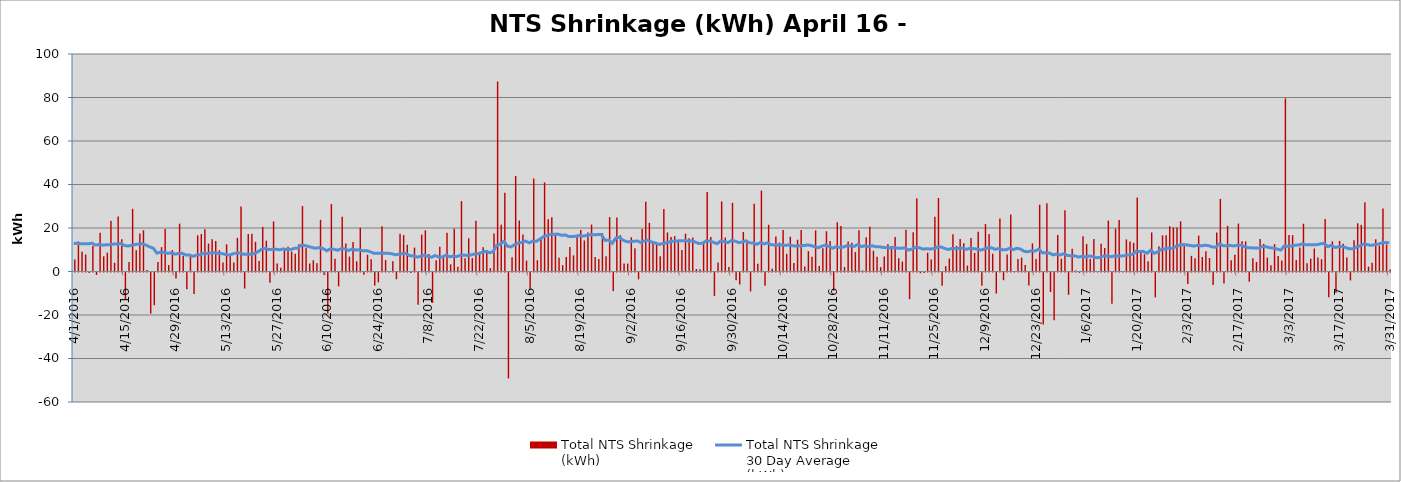
| Category | Total NTS Shrinkage
(kWh) |
|---|---|
| 4/1/16 | 5535887 |
| 4/2/16 | 13806413 |
| 4/3/16 | 9043796 |
| 4/4/16 | 7818288 |
| 4/5/16 | -262975 |
| 4/6/16 | 11727477 |
| 4/7/16 | -1105545 |
| 4/8/16 | 17761218 |
| 4/9/16 | 6972202 |
| 4/10/16 | 8642126 |
| 4/11/16 | 23282328 |
| 4/12/16 | 4011712 |
| 4/13/16 | 25294229 |
| 4/14/16 | 14867007 |
| 4/15/16 | -12330640 |
| 4/16/16 | 4421650 |
| 4/17/16 | 28817961 |
| 4/18/16 | 9772450 |
| 4/19/16 | 17524811 |
| 4/20/16 | 18972605 |
| 4/21/16 | 736150 |
| 4/22/16 | -18893691 |
| 4/23/16 | -15030541 |
| 4/24/16 | 4410582 |
| 4/25/16 | 11186961 |
| 4/26/16 | 19550488 |
| 4/27/16 | 2937112 |
| 4/28/16 | 9830118 |
| 4/29/16 | -2779713 |
| 4/30/16 | 22015972 |
| 5/1/16 | 7262252 |
| 5/2/16 | -7711497 |
| 5/3/16 | 7719483 |
| 5/4/16 | -9850590 |
| 5/5/16 | 16650554 |
| 5/6/16 | 17218141 |
| 5/7/16 | 19382453 |
| 5/8/16 | 12860168 |
| 5/9/16 | 14794720 |
| 5/10/16 | 13971912 |
| 5/11/16 | 9775796 |
| 5/12/16 | 4120797 |
| 5/13/16 | 12513168 |
| 5/14/16 | 7119777 |
| 5/15/16 | 4094843 |
| 5/16/16 | 15469294 |
| 5/17/16 | 29934743 |
| 5/18/16 | -7371971 |
| 5/19/16 | 17247708 |
| 5/20/16 | 17309931 |
| 5/21/16 | 13644269 |
| 5/22/16 | 4817087 |
| 5/23/16 | 20541324 |
| 5/24/16 | 14177822 |
| 5/25/16 | -4707552 |
| 5/26/16 | 23011309 |
| 5/27/16 | 3632244 |
| 5/28/16 | 1768132 |
| 5/29/16 | 10438132 |
| 5/30/16 | 11339676 |
| 5/31/16 | 9140720 |
| 6/1/16 | 8213635 |
| 6/2/16 | 12507140 |
| 6/3/16 | 30059560 |
| 6/4/16 | 10862901 |
| 6/5/16 | 3662227 |
| 6/6/16 | 5151322 |
| 6/7/16 | 3836781 |
| 6/8/16 | 23750954 |
| 6/9/16 | -1099687 |
| 6/10/16 | -18814241 |
| 6/11/16 | 30977345 |
| 6/12/16 | 5807415 |
| 6/13/16 | -6386243 |
| 6/14/16 | 25222743 |
| 6/15/16 | 12856348 |
| 6/16/16 | 6869801 |
| 6/17/16 | 13528859 |
| 6/18/16 | 4698453 |
| 6/19/16 | 20094654 |
| 6/20/16 | -1000782 |
| 6/21/16 | 7684253 |
| 6/22/16 | 5607083 |
| 6/23/16 | -5980700 |
| 6/24/16 | -4521270 |
| 6/25/16 | 20855920 |
| 6/26/16 | 5253551 |
| 6/27/16 | 5006 |
| 6/28/16 | 4663169 |
| 6/29/16 | -3116849 |
| 6/30/16 | 17332159 |
| 7/1/16 | 16724151 |
| 7/2/16 | 12317452 |
| 7/3/16 | -280087 |
| 7/4/16 | 11000825 |
| 7/5/16 | -14883298 |
| 7/6/16 | 16949783 |
| 7/7/16 | 18952385 |
| 7/8/16 | 8029232 |
| 7/9/16 | -13945656 |
| 7/10/16 | 5147579 |
| 7/11/16 | 11349203 |
| 7/12/16 | 6455553 |
| 7/13/16 | 17783295 |
| 7/14/16 | 3302864 |
| 7/15/16 | 19651452 |
| 7/16/16 | 2151943 |
| 7/17/16 | 32356615 |
| 7/18/16 | 6107781 |
| 7/19/16 | 15313466 |
| 7/20/16 | 6126734 |
| 7/21/16 | 23346874 |
| 7/22/16 | 8834324 |
| 7/23/16 | 11198631 |
| 7/24/16 | 9888902 |
| 7/25/16 | 1532877 |
| 7/26/16 | 17518053 |
| 7/27/16 | 87344065 |
| 7/28/16 | 21538678 |
| 7/29/16 | 36192775 |
| 7/30/16 | -48697675 |
| 7/31/16 | 6540659 |
| 8/1/16 | 43887632 |
| 8/2/16 | 23447480 |
| 8/3/16 | 16998393 |
| 8/4/16 | 4988257 |
| 8/5/16 | -7742341 |
| 8/6/16 | 42803467 |
| 8/7/16 | 5165573 |
| 8/8/16 | 15637054 |
| 8/9/16 | 40979782 |
| 8/10/16 | 24078638 |
| 8/11/16 | 24929738 |
| 8/12/16 | 17385018 |
| 8/13/16 | 6318473 |
| 8/14/16 | 2880706 |
| 8/15/16 | 6676283 |
| 8/16/16 | 11280275 |
| 8/17/16 | 7422291 |
| 8/18/16 | 16899808 |
| 8/19/16 | 19043488 |
| 8/20/16 | 14264003 |
| 8/21/16 | 17949251 |
| 8/22/16 | 21567521 |
| 8/23/16 | 6691811 |
| 8/24/16 | 5775398 |
| 8/25/16 | 17661778 |
| 8/26/16 | 6996124 |
| 8/27/16 | 25043626 |
| 8/28/16 | -8487072 |
| 8/29/16 | 24853442 |
| 8/30/16 | 16674340 |
| 8/31/16 | 3708355 |
| 9/1/16 | 3640916 |
| 9/2/16 | 15722176 |
| 9/3/16 | 10729211 |
| 9/4/16 | -3119441 |
| 9/5/16 | 19494529 |
| 9/6/16 | 32077366 |
| 9/7/16 | 22399780 |
| 9/8/16 | 12587903 |
| 9/9/16 | 12603573 |
| 9/10/16 | 7039286 |
| 9/11/16 | 28748535 |
| 9/12/16 | 17965831 |
| 9/13/16 | 15837631 |
| 9/14/16 | 16257489 |
| 9/15/16 | 13835925 |
| 9/16/16 | 9829408 |
| 9/17/16 | 17416574 |
| 9/18/16 | 15334650 |
| 9/19/16 | 15613008 |
| 9/20/16 | 1159008 |
| 9/21/16 | 1017889 |
| 9/22/16 | 13267285 |
| 9/23/16 | 36569663 |
| 9/24/16 | 15860370 |
| 9/25/16 | -10746731 |
| 9/26/16 | 4115987 |
| 9/27/16 | 32219611 |
| 9/28/16 | 15637865 |
| 9/29/16 | 2029142 |
| 9/30/16 | 31552962 |
| 10/1/16 | -3565264 |
| 10/2/16 | -5503428 |
| 10/3/16 | 18187280 |
| 10/4/16 | 14391578 |
| 10/5/16 | -8711747 |
| 10/6/16 | 31198764 |
| 10/7/16 | 3523231 |
| 10/8/16 | 37203868 |
| 10/9/16 | -6101860 |
| 10/10/16 | 21479836 |
| 10/11/16 | 1237741 |
| 10/12/16 | 16098930 |
| 10/13/16 | 13296741 |
| 10/14/16 | 19106233 |
| 10/15/16 | 8148645 |
| 10/16/16 | 15985275 |
| 10/17/16 | 3953496 |
| 10/18/16 | 14607826 |
| 10/19/16 | 19034721 |
| 10/20/16 | 2297365 |
| 10/21/16 | 9367167 |
| 10/22/16 | 6833389 |
| 10/23/16 | 18903828 |
| 10/24/16 | 2525184 |
| 10/25/16 | 10637314 |
| 10/26/16 | 18505873 |
| 10/27/16 | 14076495 |
| 10/28/16 | -8312953 |
| 10/29/16 | 22644130 |
| 10/30/16 | 20906260 |
| 10/31/16 | 2029439 |
| 11/1/16 | 13810020 |
| 11/2/16 | 13263169 |
| 11/3/16 | 8934208 |
| 11/4/16 | 18929796 |
| 11/5/16 | 493963 |
| 11/6/16 | 15792225 |
| 11/7/16 | 20569945 |
| 11/8/16 | 9543595 |
| 11/9/16 | 6815381 |
| 11/10/16 | 2008042 |
| 11/11/16 | 6842275 |
| 11/12/16 | 12534195 |
| 11/13/16 | 11737492 |
| 11/14/16 | 15811471 |
| 11/15/16 | 6056768 |
| 11/16/16 | 4594810 |
| 11/17/16 | 19219318 |
| 11/18/16 | -12283176 |
| 11/19/16 | 18056112 |
| 11/20/16 | 33622235 |
| 11/21/16 | -345701 |
| 11/22/16 | -262601 |
| 11/23/16 | 8655821 |
| 11/24/16 | 5483747 |
| 11/25/16 | 25203067 |
| 11/26/16 | 33792690 |
| 11/27/16 | -6148351 |
| 11/28/16 | 2465328 |
| 11/29/16 | 5970727 |
| 11/30/16 | 17112356 |
| 12/1/16 | 11772202 |
| 12/2/16 | 14945434 |
| 12/3/16 | 12992752 |
| 12/4/16 | 2738063 |
| 12/5/16 | 15394245 |
| 12/6/16 | 8560640 |
| 12/7/16 | 18238238 |
| 12/8/16 | -6137517 |
| 12/9/16 | 21796590 |
| 12/10/16 | 17298370 |
| 12/11/16 | 8162394 |
| 12/12/16 | -9662674 |
| 12/13/16 | 24361012 |
| 12/14/16 | -3553359 |
| 12/15/16 | 7860796 |
| 12/16/16 | 26228711 |
| 12/17/16 | 108375 |
| 12/18/16 | 5755006 |
| 12/19/16 | 6403176 |
| 12/20/16 | 3042419 |
| 12/21/16 | -5938774 |
| 12/22/16 | 12898332 |
| 12/23/16 | 5765469 |
| 12/24/16 | 30733298 |
| 12/25/16 | -23909427 |
| 12/26/16 | 31402668 |
| 12/27/16 | -8965641 |
| 12/28/16 | -21956468 |
| 12/29/16 | 16834190 |
| 12/30/16 | 5883732 |
| 12/31/16 | 28142475 |
| 1/1/17 | -10297616 |
| 1/2/17 | 10425836 |
| 1/3/17 | 410354 |
| 1/4/17 | -158991 |
| 1/5/17 | 16233876 |
| 1/6/17 | 12677040 |
| 1/7/17 | 5864712 |
| 1/8/17 | 14932594 |
| 1/9/17 | 245297 |
| 1/10/17 | 12805465 |
| 1/11/17 | 10812919 |
| 1/12/17 | 23394611 |
| 1/13/17 | -14423685 |
| 1/14/17 | 19720937 |
| 1/15/17 | 23631614 |
| 1/16/17 | 227959 |
| 1/17/17 | 14754776 |
| 1/18/17 | 13745766 |
| 1/19/17 | 13176722 |
| 1/20/17 | 34068821 |
| 1/21/17 | 9422662 |
| 1/22/17 | 7919789 |
| 1/23/17 | 4697536 |
| 1/24/17 | 17959666 |
| 1/25/17 | -11417492 |
| 1/26/17 | 11652845 |
| 1/27/17 | 16621557 |
| 1/28/17 | 16698470 |
| 1/29/17 | 20829657 |
| 1/30/17 | 20268729 |
| 1/31/17 | 20272371 |
| 2/1/17 | 23113426 |
| 2/2/17 | 12385322 |
| 2/3/17 | -5292013 |
| 2/4/17 | 7189466 |
| 2/5/17 | 6108355 |
| 2/6/17 | 16528155 |
| 2/7/17 | 6658608 |
| 2/8/17 | 9309409 |
| 2/9/17 | 6209782 |
| 2/10/17 | -5722212 |
| 2/11/17 | 17873968 |
| 2/12/17 | 33361117 |
| 2/13/17 | -5086155 |
| 2/14/17 | 20977709 |
| 2/15/17 | 5218042 |
| 2/16/17 | 7748299 |
| 2/17/17 | 22043887 |
| 2/18/17 | 13939369 |
| 2/19/17 | 13828051 |
| 2/20/17 | -4289446 |
| 2/21/17 | 6096416 |
| 2/22/17 | 4373822 |
| 2/23/17 | 14937865 |
| 2/24/17 | 12691115 |
| 2/25/17 | 6375044 |
| 2/26/17 | 2914220 |
| 2/27/17 | 12610881 |
| 2/28/17 | 7115888 |
| 3/1/17 | 5038746 |
| 3/2/17 | 79585927 |
| 3/3/17 | 16759914 |
| 3/4/17 | 16687821 |
| 3/5/17 | 5232717 |
| 3/6/17 | 11008623 |
| 3/7/17 | 21957720 |
| 3/8/17 | 3846521 |
| 3/9/17 | 5897117 |
| 3/10/17 | 10567496 |
| 3/11/17 | 6440265 |
| 3/12/17 | 5658373 |
| 3/13/17 | 24084287 |
| 3/14/17 | -11331106 |
| 3/15/17 | 13873210 |
| 3/16/17 | -9344440 |
| 3/17/17 | 14064483 |
| 3/18/17 | 12802526 |
| 3/19/17 | 6388161 |
| 3/20/17 | -3653134 |
| 3/21/17 | 14347787 |
| 3/22/17 | 22171919 |
| 3/23/17 | 21452432 |
| 3/24/17 | 31822379 |
| 3/25/17 | 2220115 |
| 3/26/17 | 4004142 |
| 3/27/17 | 14874237 |
| 3/28/17 | 11909033 |
| 3/29/17 | 28976051 |
| 3/30/17 | 12423183 |
| 3/31/17 | 869507 |